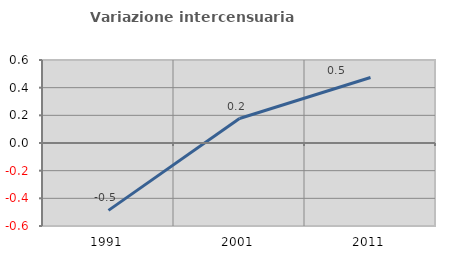
| Category | Variazione intercensuaria annua |
|---|---|
| 1991.0 | -0.487 |
| 2001.0 | 0.177 |
| 2011.0 | 0.473 |